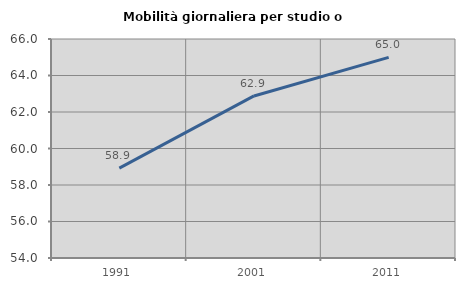
| Category | Mobilità giornaliera per studio o lavoro |
|---|---|
| 1991.0 | 58.925 |
| 2001.0 | 62.88 |
| 2011.0 | 64.994 |